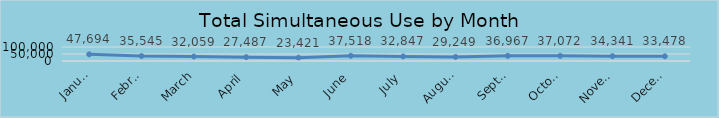
| Category | Series 0 |
|---|---|
| January | 47694 |
| February | 35545 |
| March | 32059 |
| April | 27487 |
| May | 23421 |
| June | 37518 |
| July | 32847 |
| August | 29249 |
| September | 36967 |
| October | 37072 |
| November | 34341 |
| December | 33478 |